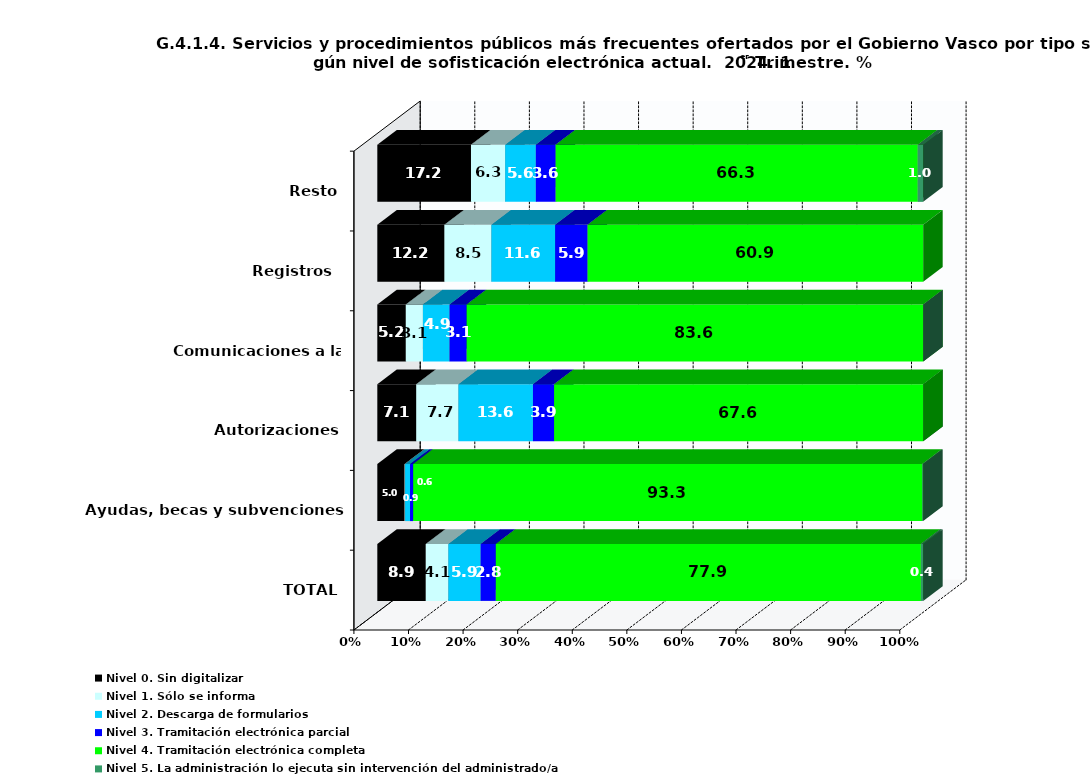
| Category | Nivel 0. Sin digitalizar | Nivel 1. Sólo se informa | Nivel 2. Descarga de formularios | Nivel 3. Tramitación electrónica parcial | Nivel 4. Tramitación electrónica completa | Nivel 5. La administración lo ejecuta sin intervención del administrado/a |
|---|---|---|---|---|---|---|
| TOTAL | 8.885 | 4.136 | 5.913 | 2.779 | 77.868 | 0.42 |
| Ayudas, becas y subvenciones | 5.008 | 0.082 | 0.903 | 0.575 | 93.268 | 0.164 |
| Autorizaciones | 7.128 | 7.739 | 13.646 | 3.87 | 67.617 | 0 |
| Comunicaciones a la Administración | 5.226 | 3.136 | 4.878 | 3.136 | 83.624 | 0 |
| Registros  | 12.17 | 8.519 | 11.562 | 5.882 | 60.852 | 0 |
| Resto | 17.162 | 6.271 | 5.611 | 3.63 | 66.337 | 0.99 |